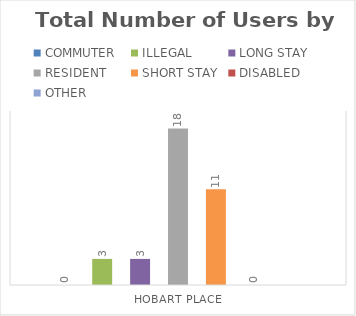
| Category | COMMUTER | ILLEGAL | LONG STAY | RESIDENT | SHORT STAY | DISABLED | OTHER |
|---|---|---|---|---|---|---|---|
| HOBART PLACE | 0 | 3 | 3 | 18 | 11 | 0 | 0 |